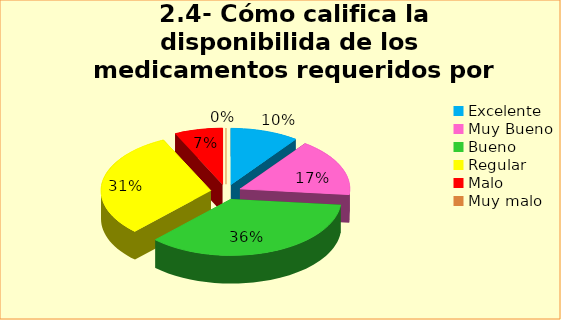
| Category | Series 0 |
|---|---|
| Excelente | 0.101 |
| Muy Bueno | 0.166 |
| Bueno  | 0.355 |
| Regular  | 0.308 |
| Malo  | 0.071 |
| Muy malo  | 0 |